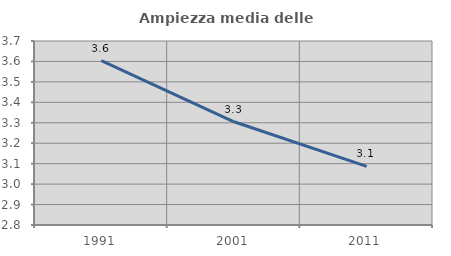
| Category | Ampiezza media delle famiglie |
|---|---|
| 1991.0 | 3.604 |
| 2001.0 | 3.305 |
| 2011.0 | 3.087 |